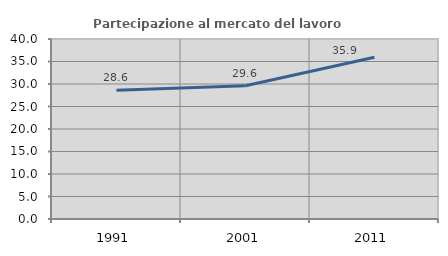
| Category | Partecipazione al mercato del lavoro  femminile |
|---|---|
| 1991.0 | 28.632 |
| 2001.0 | 29.601 |
| 2011.0 | 35.928 |